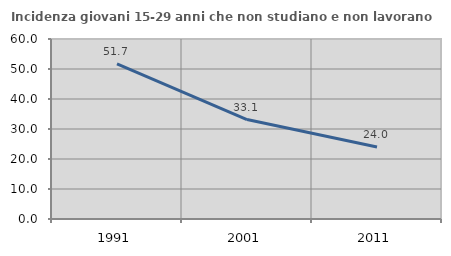
| Category | Incidenza giovani 15-29 anni che non studiano e non lavorano  |
|---|---|
| 1991.0 | 51.679 |
| 2001.0 | 33.14 |
| 2011.0 | 24 |